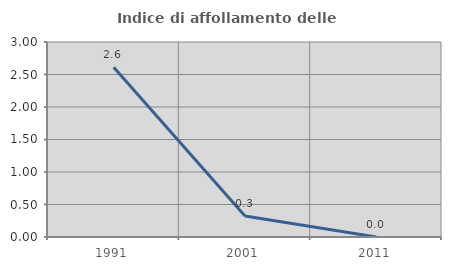
| Category | Indice di affollamento delle abitazioni  |
|---|---|
| 1991.0 | 2.612 |
| 2001.0 | 0.324 |
| 2011.0 | 0 |